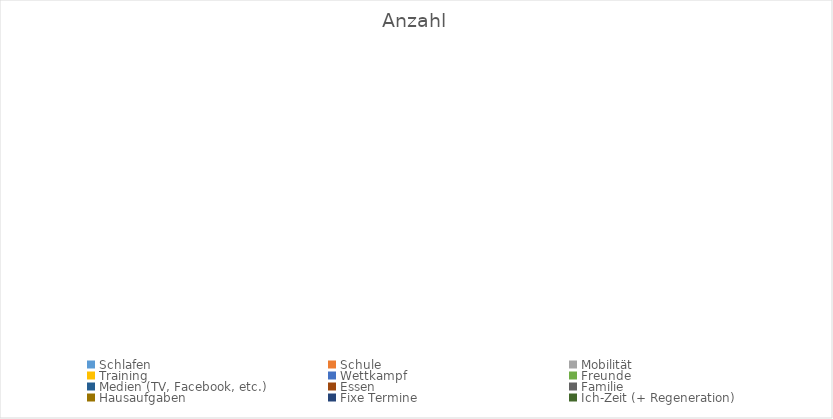
| Category | Anzahl | Minuten | Stunden |
|---|---|---|---|
| Schlafen | 0 | 0 | 0 |
| Schule | 0 | 0 | 0 |
| Mobilität | 0 | 0 | 0 |
| Training | 0 | 0 | 0 |
| Wettkampf | 0 | 0 | 0 |
| Freunde | 0 | 0 | 0 |
| Medien (TV, Facebook, etc.) | 0 | 0 | 0 |
| Essen | 0 | 0 | 0 |
| Familie | 0 | 0 | 0 |
| Hausaufgaben | 0 | 0 | 0 |
| Fixe Termine | 0 | 0 | 0 |
| Ich-Zeit (+ Regeneration) | 0 | 0 | 0 |